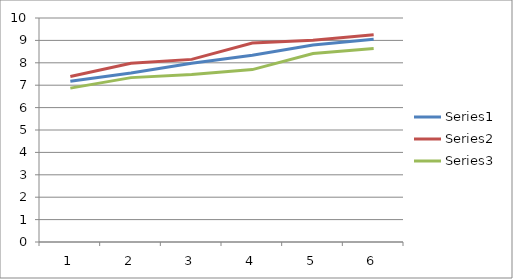
| Category | Series 0 | Series 1 | Series 2 |
|---|---|---|---|
| 0 | 7.179 | 7.392 | 6.87 |
| 1 | 7.543 | 7.976 | 7.338 |
| 2 | 7.975 | 8.153 | 7.473 |
| 3 | 8.333 | 8.882 | 7.696 |
| 4 | 8.791 | 9.009 | 8.418 |
| 5 | 9.047 | 9.257 | 8.636 |